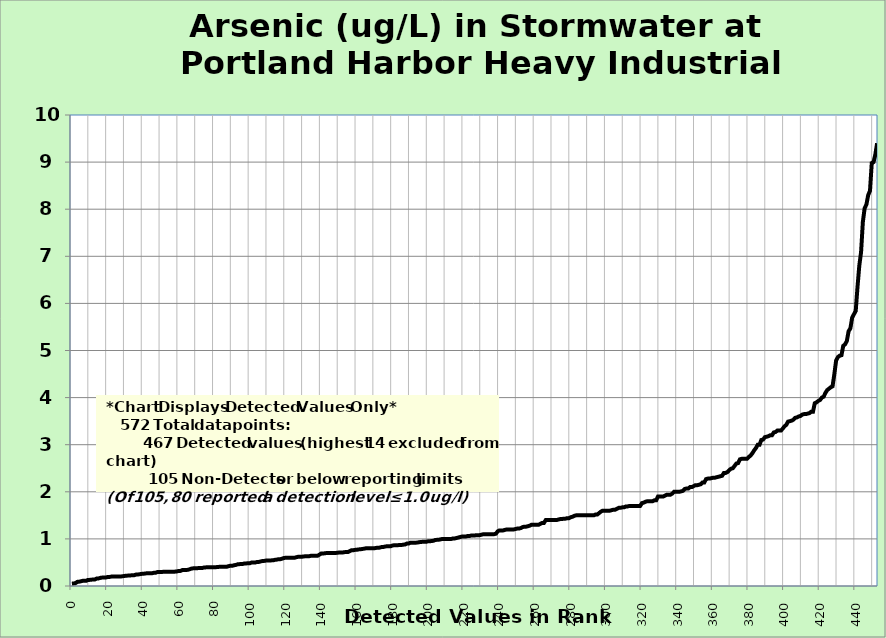
| Category | Arsenic |
|---|---|
| 0.0 | 0.05 |
| 1.0 | 0.054 |
| 2.0 | 0.06 |
| 3.0 | 0.088 |
| 4.0 | 0.091 |
| 5.0 | 0.1 |
| 6.0 | 0.109 |
| 7.0 | 0.11 |
| 8.0 | 0.111 |
| 9.0 | 0.13 |
| 10.0 | 0.13 |
| 11.0 | 0.134 |
| 12.0 | 0.14 |
| 13.0 | 0.14 |
| 14.0 | 0.161 |
| 15.0 | 0.161 |
| 16.0 | 0.173 |
| 17.0 | 0.179 |
| 18.0 | 0.18 |
| 19.0 | 0.18 |
| 20.0 | 0.19 |
| 21.0 | 0.191 |
| 22.0 | 0.199 |
| 23.0 | 0.2 |
| 24.0 | 0.2 |
| 25.0 | 0.2 |
| 26.0 | 0.2 |
| 27.0 | 0.2 |
| 28.0 | 0.205 |
| 29.0 | 0.21 |
| 30.0 | 0.216 |
| 31.0 | 0.22 |
| 32.0 | 0.221 |
| 33.0 | 0.225 |
| 34.0 | 0.23 |
| 35.0 | 0.23 |
| 36.0 | 0.243 |
| 37.0 | 0.244 |
| 38.0 | 0.25 |
| 39.0 | 0.257 |
| 40.0 | 0.26 |
| 41.0 | 0.264 |
| 42.0 | 0.27 |
| 43.0 | 0.27 |
| 44.0 | 0.271 |
| 45.0 | 0.271 |
| 46.0 | 0.28 |
| 47.0 | 0.281 |
| 48.0 | 0.296 |
| 49.0 | 0.297 |
| 50.0 | 0.298 |
| 51.0 | 0.3 |
| 52.0 | 0.3 |
| 53.0 | 0.3 |
| 54.0 | 0.3 |
| 55.0 | 0.3 |
| 56.0 | 0.3 |
| 57.0 | 0.3 |
| 58.0 | 0.306 |
| 59.0 | 0.31 |
| 60.0 | 0.32 |
| 61.0 | 0.321 |
| 62.0 | 0.338 |
| 63.0 | 0.34 |
| 64.0 | 0.34 |
| 65.0 | 0.343 |
| 66.0 | 0.354 |
| 67.0 | 0.368 |
| 68.0 | 0.375 |
| 69.0 | 0.377 |
| 70.0 | 0.378 |
| 71.0 | 0.38 |
| 72.0 | 0.38 |
| 73.0 | 0.38 |
| 74.0 | 0.391 |
| 75.0 | 0.394 |
| 76.0 | 0.4 |
| 77.0 | 0.4 |
| 78.0 | 0.4 |
| 79.0 | 0.4 |
| 80.0 | 0.4 |
| 81.0 | 0.4 |
| 82.0 | 0.405 |
| 83.0 | 0.407 |
| 84.0 | 0.408 |
| 85.0 | 0.41 |
| 86.0 | 0.41 |
| 87.0 | 0.41 |
| 88.0 | 0.422 |
| 89.0 | 0.43 |
| 90.0 | 0.43 |
| 91.0 | 0.44 |
| 92.0 | 0.447 |
| 93.0 | 0.46 |
| 94.0 | 0.464 |
| 95.0 | 0.468 |
| 96.0 | 0.469 |
| 97.0 | 0.48 |
| 98.0 | 0.48 |
| 99.0 | 0.483 |
| 100.0 | 0.485 |
| 101.0 | 0.5 |
| 102.0 | 0.5 |
| 103.0 | 0.5 |
| 104.0 | 0.51 |
| 105.0 | 0.512 |
| 106.0 | 0.522 |
| 107.0 | 0.53 |
| 108.0 | 0.533 |
| 109.0 | 0.54 |
| 110.0 | 0.544 |
| 111.0 | 0.544 |
| 112.0 | 0.544 |
| 113.0 | 0.545 |
| 114.0 | 0.556 |
| 115.0 | 0.56 |
| 116.0 | 0.57 |
| 117.0 | 0.57 |
| 118.0 | 0.58 |
| 119.0 | 0.594 |
| 120.0 | 0.6 |
| 121.0 | 0.6 |
| 122.0 | 0.6 |
| 123.0 | 0.6 |
| 124.0 | 0.6 |
| 125.0 | 0.6 |
| 126.0 | 0.611 |
| 127.0 | 0.62 |
| 128.0 | 0.62 |
| 129.0 | 0.62 |
| 130.0 | 0.628 |
| 131.0 | 0.63 |
| 132.0 | 0.63 |
| 133.0 | 0.631 |
| 134.0 | 0.64 |
| 135.0 | 0.64 |
| 136.0 | 0.64 |
| 137.0 | 0.644 |
| 138.0 | 0.644 |
| 139.0 | 0.667 |
| 140.0 | 0.69 |
| 141.0 | 0.69 |
| 142.0 | 0.695 |
| 143.0 | 0.7 |
| 144.0 | 0.7 |
| 145.0 | 0.7 |
| 146.0 | 0.7 |
| 147.0 | 0.7 |
| 148.0 | 0.701 |
| 149.0 | 0.706 |
| 150.0 | 0.71 |
| 151.0 | 0.71 |
| 152.0 | 0.711 |
| 153.0 | 0.719 |
| 154.0 | 0.72 |
| 155.0 | 0.722 |
| 156.0 | 0.74 |
| 157.0 | 0.76 |
| 158.0 | 0.76 |
| 159.0 | 0.767 |
| 160.0 | 0.77 |
| 161.0 | 0.777 |
| 162.0 | 0.78 |
| 163.0 | 0.786 |
| 164.0 | 0.792 |
| 165.0 | 0.8 |
| 166.0 | 0.8 |
| 167.0 | 0.8 |
| 168.0 | 0.8 |
| 169.0 | 0.8 |
| 170.0 | 0.803 |
| 171.0 | 0.81 |
| 172.0 | 0.81 |
| 173.0 | 0.817 |
| 174.0 | 0.83 |
| 175.0 | 0.83 |
| 176.0 | 0.84 |
| 177.0 | 0.843 |
| 178.0 | 0.844 |
| 179.0 | 0.845 |
| 180.0 | 0.86 |
| 181.0 | 0.866 |
| 182.0 | 0.867 |
| 183.0 | 0.867 |
| 184.0 | 0.87 |
| 185.0 | 0.87 |
| 186.0 | 0.878 |
| 187.0 | 0.88 |
| 188.0 | 0.9 |
| 189.0 | 0.9 |
| 190.0 | 0.92 |
| 191.0 | 0.92 |
| 192.0 | 0.92 |
| 193.0 | 0.92 |
| 194.0 | 0.922 |
| 195.0 | 0.931 |
| 196.0 | 0.934 |
| 197.0 | 0.94 |
| 198.0 | 0.94 |
| 199.0 | 0.94 |
| 200.0 | 0.95 |
| 201.0 | 0.95 |
| 202.0 | 0.956 |
| 203.0 | 0.96 |
| 204.0 | 0.978 |
| 205.0 | 0.98 |
| 206.0 | 0.983 |
| 207.0 | 0.99 |
| 208.0 | 1 |
| 209.0 | 1 |
| 210.0 | 1 |
| 211.0 | 1 |
| 212.0 | 1 |
| 213.0 | 1 |
| 214.0 | 1.01 |
| 215.0 | 1.01 |
| 216.0 | 1.02 |
| 217.0 | 1.03 |
| 218.0 | 1.04 |
| 219.0 | 1.05 |
| 220.0 | 1.05 |
| 221.0 | 1.05 |
| 222.0 | 1.06 |
| 223.0 | 1.06 |
| 224.0 | 1.07 |
| 225.0 | 1.07 |
| 226.0 | 1.07 |
| 227.0 | 1.08 |
| 228.0 | 1.08 |
| 229.0 | 1.08 |
| 230.0 | 1.09 |
| 231.0 | 1.1 |
| 232.0 | 1.1 |
| 233.0 | 1.1 |
| 234.0 | 1.1 |
| 235.0 | 1.1 |
| 236.0 | 1.1 |
| 237.0 | 1.1 |
| 238.0 | 1.11 |
| 239.0 | 1.16 |
| 240.0 | 1.18 |
| 241.0 | 1.18 |
| 242.0 | 1.18 |
| 243.0 | 1.19 |
| 244.0 | 1.2 |
| 245.0 | 1.2 |
| 246.0 | 1.2 |
| 247.0 | 1.2 |
| 248.0 | 1.2 |
| 249.0 | 1.21 |
| 250.0 | 1.22 |
| 251.0 | 1.22 |
| 252.0 | 1.23 |
| 253.0 | 1.25 |
| 254.0 | 1.26 |
| 255.0 | 1.26 |
| 256.0 | 1.27 |
| 257.0 | 1.28 |
| 258.0 | 1.3 |
| 259.0 | 1.3 |
| 260.0 | 1.3 |
| 261.0 | 1.3 |
| 262.0 | 1.3 |
| 263.0 | 1.32 |
| 264.0 | 1.34 |
| 265.0 | 1.34 |
| 266.0 | 1.4 |
| 267.0 | 1.4 |
| 268.0 | 1.4 |
| 269.0 | 1.4 |
| 270.0 | 1.4 |
| 271.0 | 1.4 |
| 272.0 | 1.4 |
| 273.0 | 1.41 |
| 274.0 | 1.42 |
| 275.0 | 1.42 |
| 276.0 | 1.43 |
| 277.0 | 1.43 |
| 278.0 | 1.44 |
| 279.0 | 1.44 |
| 280.0 | 1.46 |
| 281.0 | 1.47 |
| 282.0 | 1.49 |
| 283.0 | 1.5 |
| 284.0 | 1.5 |
| 285.0 | 1.5 |
| 286.0 | 1.5 |
| 287.0 | 1.5 |
| 288.0 | 1.5 |
| 289.0 | 1.5 |
| 290.0 | 1.5 |
| 291.0 | 1.5 |
| 292.0 | 1.5 |
| 293.0 | 1.5 |
| 294.0 | 1.52 |
| 295.0 | 1.52 |
| 296.0 | 1.55 |
| 297.0 | 1.58 |
| 298.0 | 1.6 |
| 299.0 | 1.6 |
| 300.0 | 1.6 |
| 301.0 | 1.6 |
| 302.0 | 1.6 |
| 303.0 | 1.61 |
| 304.0 | 1.62 |
| 305.0 | 1.62 |
| 306.0 | 1.64 |
| 307.0 | 1.66 |
| 308.0 | 1.66 |
| 309.0 | 1.67 |
| 310.0 | 1.67 |
| 311.0 | 1.69 |
| 312.0 | 1.69 |
| 313.0 | 1.7 |
| 314.0 | 1.7 |
| 315.0 | 1.7 |
| 316.0 | 1.7 |
| 317.0 | 1.7 |
| 318.0 | 1.7 |
| 319.0 | 1.7 |
| 320.0 | 1.76 |
| 321.0 | 1.77 |
| 322.0 | 1.79 |
| 323.0 | 1.8 |
| 324.0 | 1.8 |
| 325.0 | 1.8 |
| 326.0 | 1.8 |
| 327.0 | 1.82 |
| 328.0 | 1.82 |
| 329.0 | 1.9 |
| 330.0 | 1.9 |
| 331.0 | 1.9 |
| 332.0 | 1.9 |
| 333.0 | 1.92 |
| 334.0 | 1.94 |
| 335.0 | 1.94 |
| 336.0 | 1.94 |
| 337.0 | 1.96 |
| 338.0 | 2 |
| 339.0 | 2 |
| 340.0 | 2 |
| 341.0 | 2 |
| 342.0 | 2.01 |
| 343.0 | 2.02 |
| 344.0 | 2.06 |
| 345.0 | 2.07 |
| 346.0 | 2.07 |
| 347.0 | 2.1 |
| 348.0 | 2.1 |
| 349.0 | 2.12 |
| 350.0 | 2.14 |
| 351.0 | 2.14 |
| 352.0 | 2.15 |
| 353.0 | 2.16 |
| 354.0 | 2.2 |
| 355.0 | 2.2 |
| 356.0 | 2.27 |
| 357.0 | 2.28 |
| 358.0 | 2.28 |
| 359.0 | 2.29 |
| 360.0 | 2.3 |
| 361.0 | 2.3 |
| 362.0 | 2.31 |
| 363.0 | 2.32 |
| 364.0 | 2.33 |
| 365.0 | 2.34 |
| 366.0 | 2.4 |
| 367.0 | 2.4 |
| 368.0 | 2.42 |
| 369.0 | 2.46 |
| 370.0 | 2.49 |
| 371.0 | 2.5 |
| 372.0 | 2.55 |
| 373.0 | 2.6 |
| 374.0 | 2.61 |
| 375.0 | 2.69 |
| 376.0 | 2.7 |
| 377.0 | 2.7 |
| 378.0 | 2.7 |
| 379.0 | 2.7 |
| 380.0 | 2.74 |
| 381.0 | 2.77 |
| 382.0 | 2.82 |
| 383.0 | 2.88 |
| 384.0 | 2.93 |
| 385.0 | 3 |
| 386.0 | 3 |
| 387.0 | 3.1 |
| 388.0 | 3.11 |
| 389.0 | 3.16 |
| 390.0 | 3.17 |
| 391.0 | 3.18 |
| 392.0 | 3.2 |
| 393.0 | 3.2 |
| 394.0 | 3.26 |
| 395.0 | 3.27 |
| 396.0 | 3.3 |
| 397.0 | 3.3 |
| 398.0 | 3.3 |
| 399.0 | 3.34 |
| 400.0 | 3.39 |
| 401.0 | 3.42 |
| 402.0 | 3.49 |
| 403.0 | 3.5 |
| 404.0 | 3.51 |
| 405.0 | 3.53 |
| 406.0 | 3.57 |
| 407.0 | 3.58 |
| 408.0 | 3.6 |
| 409.0 | 3.61 |
| 410.0 | 3.64 |
| 411.0 | 3.65 |
| 412.0 | 3.65 |
| 413.0 | 3.66 |
| 414.0 | 3.67 |
| 415.0 | 3.7 |
| 416.0 | 3.7 |
| 417.0 | 3.88 |
| 418.0 | 3.9 |
| 419.0 | 3.93 |
| 420.0 | 3.95 |
| 421.0 | 4 |
| 422.0 | 4.02 |
| 423.0 | 4.1 |
| 424.0 | 4.16 |
| 425.0 | 4.19 |
| 426.0 | 4.22 |
| 427.0 | 4.24 |
| 428.0 | 4.5 |
| 429.0 | 4.79 |
| 430.0 | 4.86 |
| 431.0 | 4.89 |
| 432.0 | 4.9 |
| 433.0 | 5.1 |
| 434.0 | 5.13 |
| 435.0 | 5.2 |
| 436.0 | 5.41 |
| 437.0 | 5.47 |
| 438.0 | 5.7 |
| 439.0 | 5.77 |
| 440.0 | 5.84 |
| 441.0 | 6.35 |
| 442.0 | 6.8 |
| 443.0 | 7.09 |
| 444.0 | 7.73 |
| 445.0 | 8.02 |
| 446.0 | 8.1 |
| 447.0 | 8.3 |
| 448.0 | 8.39 |
| 449.0 | 8.98 |
| 450.0 | 9 |
| 451.0 | 9.16 |
| 452.0 | 9.4 |